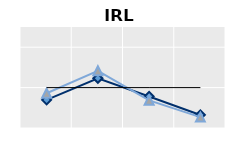
| Category | Foreign-born | Native-born | Series 1 |
|---|---|---|---|
| 15-24 | 0.696 | 0.86 | 1 |
| 25-54 | 1.232 | 1.415 | 1 |
| 55-64 | 0.781 | 0.685 | 1 |
| 65+ | 0.323 | 0.269 | 1 |